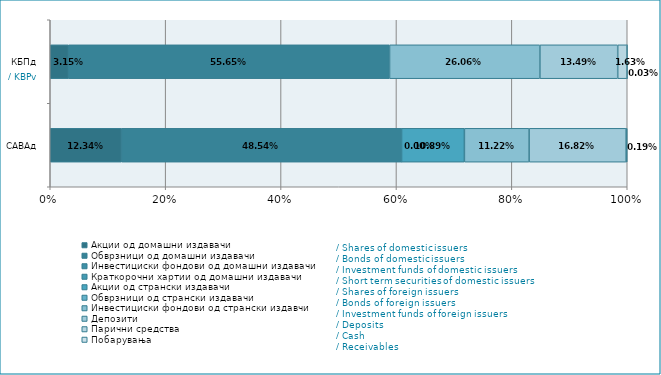
| Category | Акции од домашни издавачи  | Обврзници од домашни издавачи  | Инвестициски фондови од домашни издавачи   | Краткорочни хартии од домашни издавачи   | Акции од странски издавачи   | Обврзници од странски издавачи  | Инвестициски фондови од странски издавчи  | Депозити | Парични средства | Побарувања |
|---|---|---|---|---|---|---|---|---|---|---|
| САВАд | 0.123 | 0.485 | 0 | 0 | 0.109 | 0 | 0.112 | 0.168 | 0.002 | 0 |
| КБПд | 0.032 | 0.556 | 0 | 0 | 0 | 0 | 0.261 | 0.135 | 0.016 | 0 |